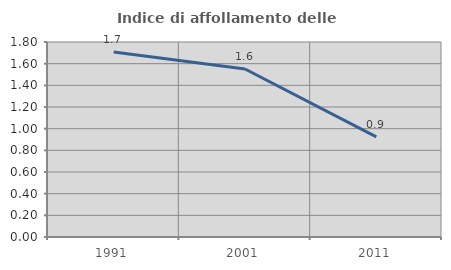
| Category | Indice di affollamento delle abitazioni  |
|---|---|
| 1991.0 | 1.707 |
| 2001.0 | 1.55 |
| 2011.0 | 0.925 |